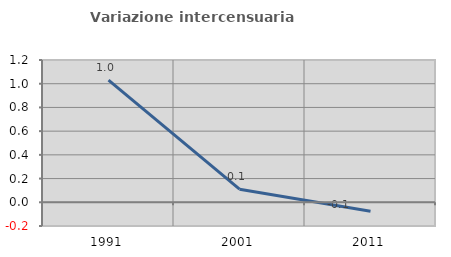
| Category | Variazione intercensuaria annua |
|---|---|
| 1991.0 | 1.03 |
| 2001.0 | 0.11 |
| 2011.0 | -0.076 |